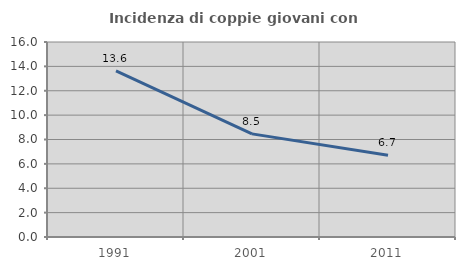
| Category | Incidenza di coppie giovani con figli |
|---|---|
| 1991.0 | 13.636 |
| 2001.0 | 8.463 |
| 2011.0 | 6.715 |